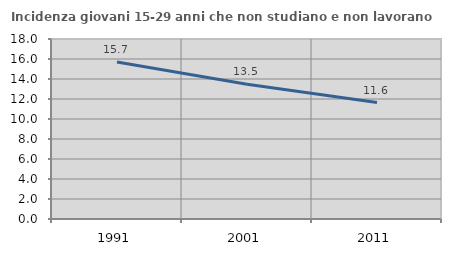
| Category | Incidenza giovani 15-29 anni che non studiano e non lavorano  |
|---|---|
| 1991.0 | 15.704 |
| 2001.0 | 13.475 |
| 2011.0 | 11.644 |